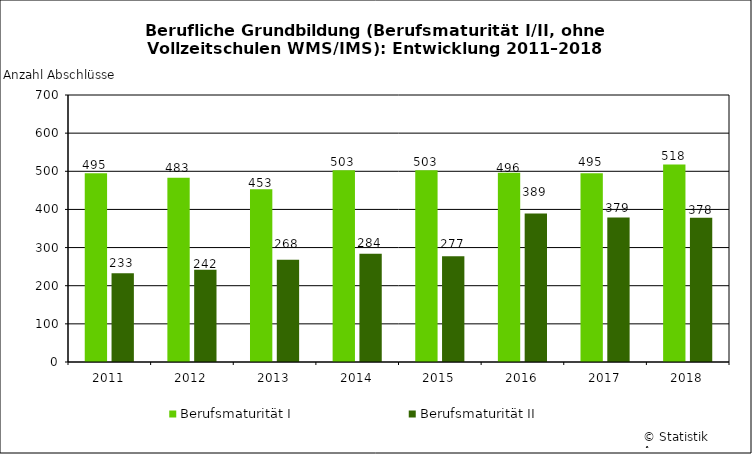
| Category | Berufsmaturität I | Berufsmaturität II |
|---|---|---|
| 2011 | 495 | 233 |
| 2012 | 483 | 242 |
| 2013 | 453 | 268 |
| 2014 | 503 | 284 |
| 2015 | 503 | 277 |
| 2016 | 496 | 389 |
| 2017 | 495 | 379 |
| 2018 | 518 | 378 |